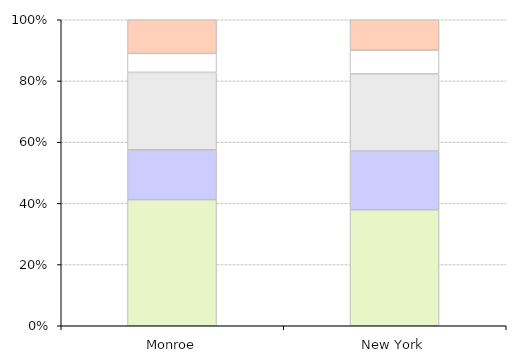
| Category | Mgnt, Business, Science & Arts Occupations | Service Occupations | Sales & Office Occupations | Natural Resources, Construction & Maintenance | Production & Transportation | Series 6 |
|---|---|---|---|---|---|---|
| Monroe | 0.412 | 0.163 | 0.253 | 0.062 | 0.11 |  |
| New York | 0.379 | 0.192 | 0.252 | 0.078 | 0.099 |  |